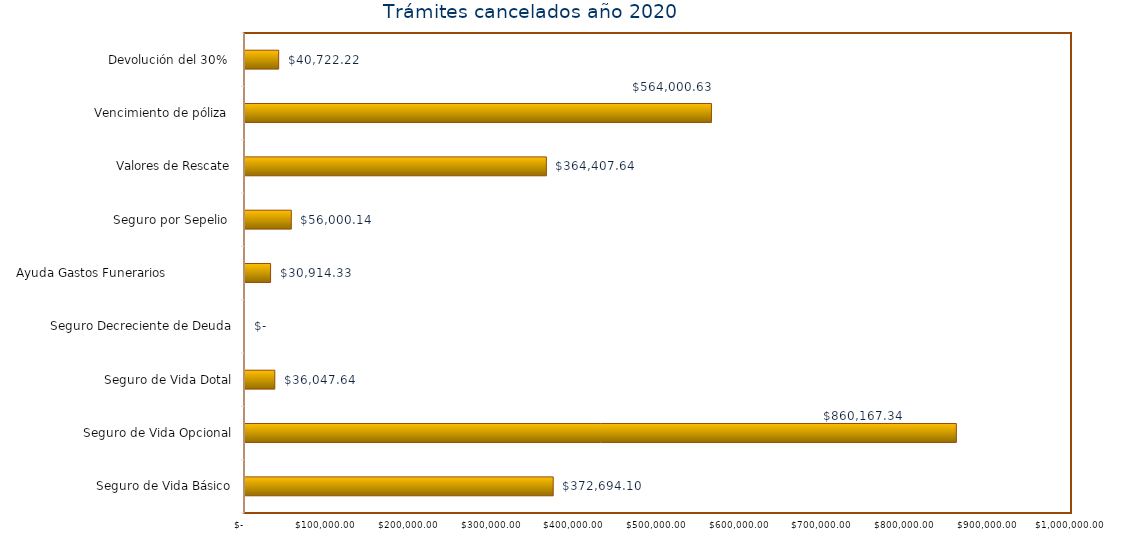
| Category | Monto  |
|---|---|
| Seguro de Vida Básico | 372694.1 |
| Seguro de Vida Opcional | 860167.34 |
| Seguro de Vida Dotal | 36047.64 |
| Seguro Decreciente de Deuda | 0 |
| Ayuda Gastos Funerarios                  | 30914.33 |
| Seguro por Sepelio  | 56000.14 |
| Valores de Rescate | 364407.64 |
| Vencimiento de póliza  | 564000.63 |
| Devolución del 30%  | 40722.22 |